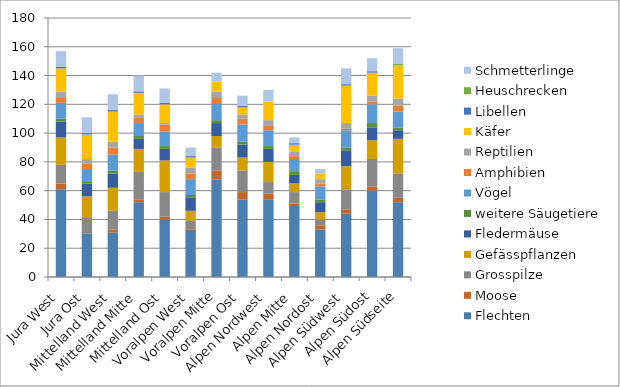
| Category | Flechten | Moose | Grosspilze | Gefässpflanzen | Fledermäuse | weitere Säugetiere | Vögel | Amphibien | Reptilien | Käfer | Libellen | Heuschrecken | Schmetterlinge |
|---|---|---|---|---|---|---|---|---|---|---|---|---|---|
| Jura West | 61 | 4 | 13 | 19 | 11 | 2 | 11 | 4 | 4 | 16 | 1 | 0 | 11 |
| Jura Ost | 30 | 0 | 11 | 15 | 9 | 1 | 9 | 4 | 3 | 17 | 1 | 0 | 11 |
| Mittelland West | 31 | 2 | 13 | 16 | 10 | 2 | 11 | 5 | 4 | 21 | 1 | 0 | 11 |
| Mittelland Mitte | 52 | 2 | 19 | 16 | 7 | 2 | 9 | 4 | 2 | 15 | 1 | 0 | 11 |
| Mittelland Ost | 40 | 2 | 17 | 22 | 8 | 2 | 10 | 5 | 1 | 13 | 1 | 0 | 10 |
| Voralpen West | 33 | 1 | 5 | 7 | 9 | 2 | 11 | 4 | 4 | 7 | 1 | 0 | 6 |
| Voralpen Mitte | 68 | 6 | 16 | 8 | 9 | 2 | 12 | 4 | 4 | 7 | 0 | 0 | 6 |
| Voralpen Ost | 54 | 5 | 15 | 9 | 9 | 2 | 12 | 4 | 3 | 5 | 1 | 0 | 7 |
| Alpen Nordwest | 54 | 4 | 8 | 14 | 9 | 2 | 11 | 3 | 4 | 13 | 0 | 0 | 8 |
| Alpen Mitte | 50 | 1 | 8 | 6 | 6 | 2 | 9 | 2 | 3 | 5 | 1 | 0 | 4 |
| Alpen Nordost | 33 | 3 | 4 | 5 | 7 | 2 | 9 | 2 | 3 | 4 | 0 | 0 | 3 |
| Alpen Südwest | 44 | 3 | 14 | 16 | 11 | 2 | 12 | 1 | 4 | 26 | 1 | 0 | 11 |
| Alpen Südost | 60 | 3 | 19 | 13 | 9 | 3 | 13 | 2 | 4 | 16 | 1 | 0 | 9 |
| Alpen Südseite | 52 | 3 | 17 | 24 | 6 | 2 | 11 | 4 | 5 | 23 | 0 | 1 | 11 |